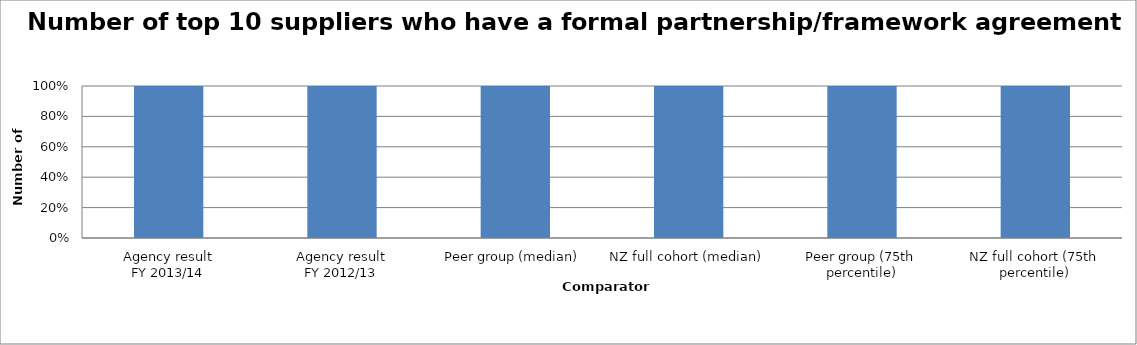
| Category | Series 0 |
|---|---|
| Agency result
FY 2013/14 | 1 |
| Agency result
FY 2012/13 | 1 |
| Peer group (median) | 1 |
| NZ full cohort (median) | 1 |
| Peer group (75th percentile) | 1 |
| NZ full cohort (75th percentile) | 1 |